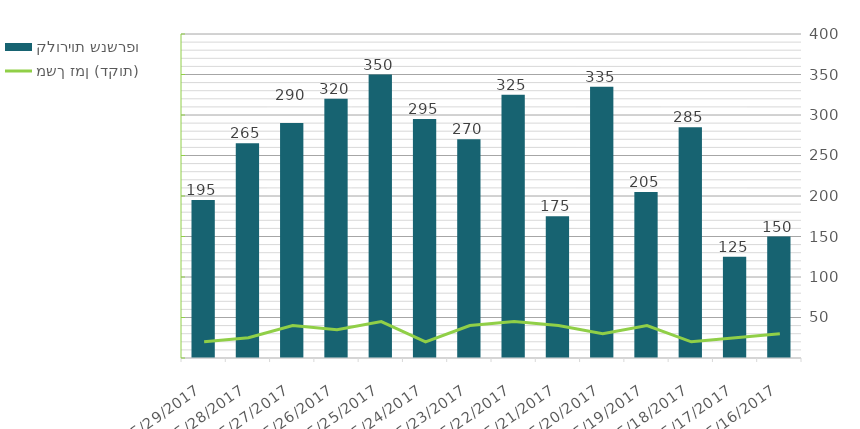
| Category | קלוריות שנשרפו |
|---|---|
| 5/29/17 | 195 |
| 5/28/17 | 265 |
| 5/27/17 | 290 |
| 5/26/17 | 320 |
| 5/25/17 | 350 |
| 5/24/17 | 295 |
| 5/23/17 | 270 |
| 5/22/17 | 325 |
| 5/21/17 | 175 |
| 5/20/17 | 335 |
| 5/19/17 | 205 |
| 5/18/17 | 285 |
| 5/17/17 | 125 |
| 5/16/17 | 150 |